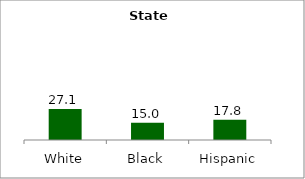
| Category | Series 0 |
|---|---|
| White | 27.11 |
| Black | 15.027 |
| Hispanic | 17.817 |